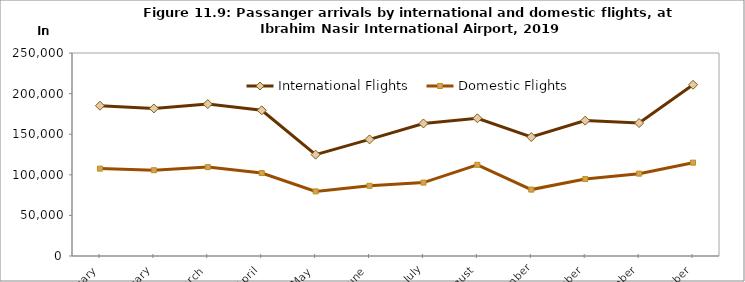
| Category | International Flights | Domestic Flights |
|---|---|---|
| January | 185073 | 107622 |
| February | 181716 | 105630 |
| March | 187082 | 109464 |
| April | 179428 | 102150 |
| May | 124830 | 79579 |
| June | 143580 | 86442 |
| July | 163224 | 90383 |
| August | 169600 | 112311 |
| September | 146522 | 81780 |
| October | 166734 | 94716 |
| November | 163740 | 101425 |
| December | 210869 | 114946 |